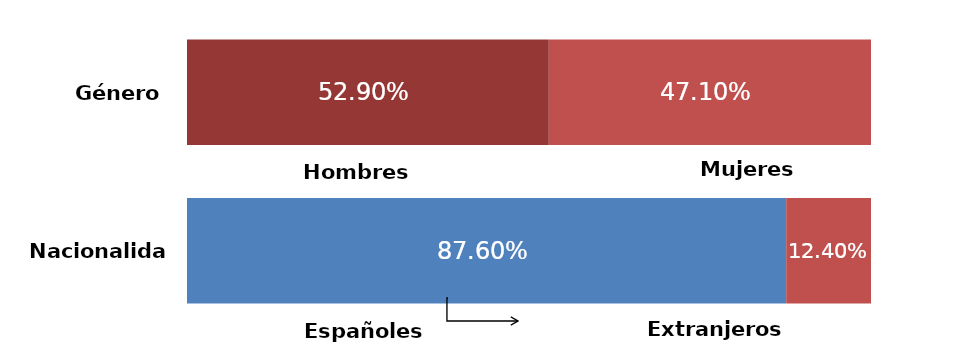
| Category | Series 0 | Series 1 |
|---|---|---|
| 0 | 0.529 | 0.471 |
| 1 | 0.876 | 0.124 |